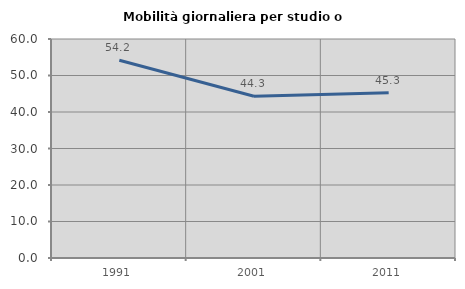
| Category | Mobilità giornaliera per studio o lavoro |
|---|---|
| 1991.0 | 54.169 |
| 2001.0 | 44.32 |
| 2011.0 | 45.273 |